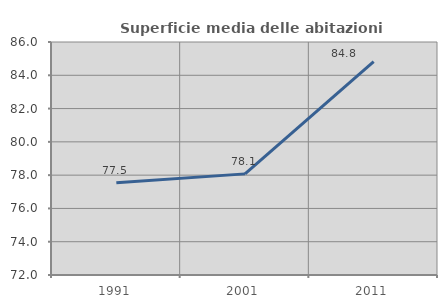
| Category | Superficie media delle abitazioni occupate |
|---|---|
| 1991.0 | 77.544 |
| 2001.0 | 78.076 |
| 2011.0 | 84.823 |